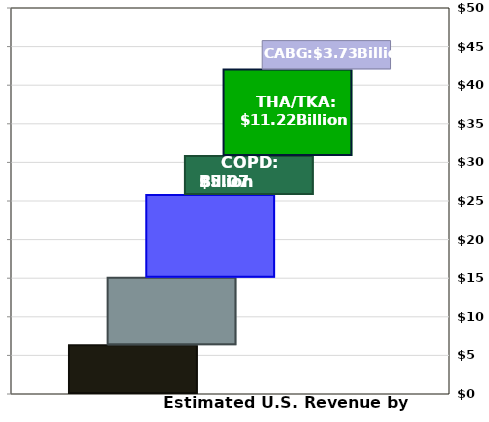
| Category | Series 0 | Series 1 | Series 2 | Series 3 | Series 4 | Series 5 |
|---|---|---|---|---|---|---|
| 0 | 6.327 | 8.726 | 10.711 | 5.067 | 11.219 | 3.729 |